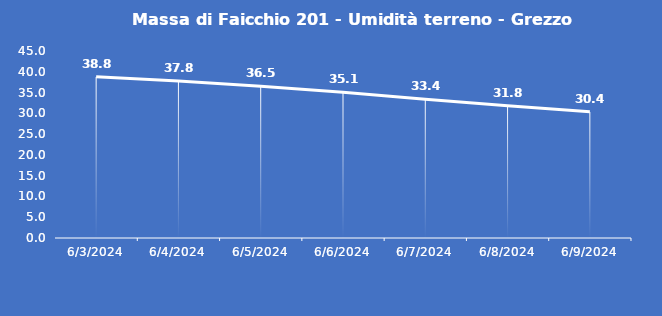
| Category | Massa di Faicchio 201 - Umidità terreno - Grezzo (%VWC) |
|---|---|
| 6/3/24 | 38.8 |
| 6/4/24 | 37.8 |
| 6/5/24 | 36.5 |
| 6/6/24 | 35.1 |
| 6/7/24 | 33.4 |
| 6/8/24 | 31.8 |
| 6/9/24 | 30.4 |